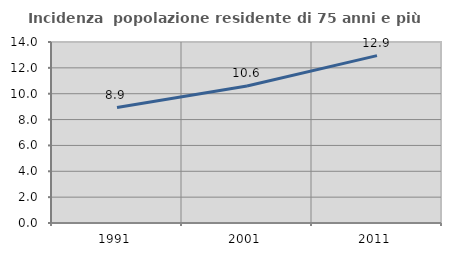
| Category | Incidenza  popolazione residente di 75 anni e più |
|---|---|
| 1991.0 | 8.929 |
| 2001.0 | 10.592 |
| 2011.0 | 12.945 |